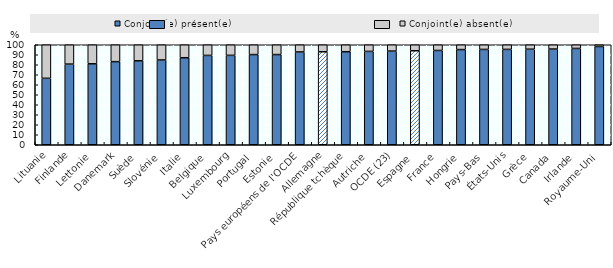
| Category | Conjoint(e) présent(e) | Conjoint(e) absent(e) |
|---|---|---|
| Lituanie | 66.44 | 33.56 |
| Finlande | 80.648 | 19.352 |
| Lettonie | 80.96 | 19.04 |
| Danemark | 83.112 | 16.888 |
| Suède | 83.933 | 16.067 |
| Slovénie | 84.796 | 15.204 |
| Italie | 87.02 | 12.98 |
| Belgique | 89.333 | 10.667 |
| Luxembourg | 89.419 | 10.581 |
| Portugal | 90.187 | 9.813 |
| Estonie | 90.189 | 9.811 |
| Pays européens de l'OCDE | 92.803 | 7.197 |
| Allemagne | 93.011 | 6.989 |
| République tchèque | 93.059 | 6.941 |
| Autriche | 93.367 | 6.633 |
| OCDE (23) | 93.66 | 6.34 |
| Espagne | 94.001 | 5.999 |
| France | 94.302 | 5.698 |
| Hongrie | 95.175 | 4.825 |
| Pays-Bas | 95.328 | 4.672 |
| États-Unis | 95.364 | 4.636 |
| Grèce | 95.561 | 4.439 |
| Canada | 95.716 | 4.284 |
| Irlande | 96.327 | 3.673 |
| Royaume-Uni | 98.242 | 1.758 |